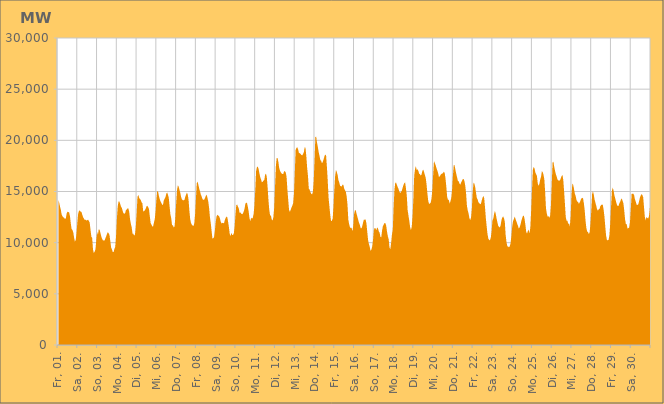
| Category | Series 0 |
|---|---|
|  Fr, 01.  | 14196.781 |
|  Fr, 01.  | 13889.029 |
|  Fr, 01.  | 13515.938 |
|  Fr, 01.  | 13191.746 |
|  Fr, 01.  | 12725.52 |
|  Fr, 01.  | 12569.547 |
|  Fr, 01.  | 12474.975 |
|  Fr, 01.  | 12420.912 |
|  Fr, 01.  | 12313.125 |
|  Fr, 01.  | 12387.478 |
|  Fr, 01.  | 12835.636 |
|  Fr, 01.  | 13022.967 |
|  Fr, 01.  | 12999.57 |
|  Fr, 01.  | 12947.606 |
|  Fr, 01.  | 12610.843 |
|  Fr, 01.  | 11909.457 |
|  Fr, 01.  | 11334.508 |
|  Sa, 02.  | 11243.651 |
|  Sa, 02.  | 11025.805 |
|  Sa, 02.  | 10510.147 |
|  Sa, 02.  | 10113.411 |
|  Sa, 02.  | 10258.602 |
|  Sa, 02.  | 10951.502 |
|  Sa, 02.  | 12000.463 |
|  Sa, 02.  | 12820.62 |
|  Sa, 02.  | 13123.107 |
|  Sa, 02.  | 13139.596 |
|  Sa, 02.  | 13026.616 |
|  Sa, 02.  | 13006.074 |
|  Sa, 02.  | 12724.557 |
|  Sa, 02.  | 12486.146 |
|  Sa, 02.  | 12350.938 |
|  Sa, 02.  | 12218.187 |
|  Sa, 02.  | 12247.661 |
|  Sa, 02.  | 12171.96 |
|  Sa, 02.  | 12195.594 |
|  Sa, 02.  | 12248.212 |
|  Sa, 02.  | 12126.515 |
|  Sa, 02.  | 11941.862 |
|  Sa, 02.  | 11243.829 |
|  Sa, 02.  | 10591.732 |
|  So, 03.  | 10466.988 |
|  So, 03.  | 9327.977 |
|  So, 03.  | 8987.732 |
|  So, 03.  | 9120.806 |
|  So, 03.  | 9350.754 |
|  So, 03.  | 10247.787 |
|  So, 03.  | 11038.326 |
|  So, 03.  | 10764.77 |
|  So, 03.  | 11330.018 |
|  So, 03.  | 11256.473 |
|  So, 03.  | 10960.041 |
|  So, 03.  | 10625.516 |
|  So, 03.  | 10383.805 |
|  So, 03.  | 10238.244 |
|  So, 03.  | 10203.821 |
|  So, 03.  | 10209.658 |
|  So, 03.  | 10414.689 |
|  So, 03.  | 10623.844 |
|  So, 03.  | 10855.771 |
|  So, 03.  | 11031.188 |
|  So, 03.  | 10917.597 |
|  So, 03.  | 10752.594 |
|  So, 03.  | 10164.223 |
|  So, 03.  | 9527.06 |
|  Mo, 04.  | 9345.043 |
|  Mo, 04.  | 9077.423 |
|  Mo, 04.  | 9075.094 |
|  Mo, 04.  | 9407.062 |
|  Mo, 04.  | 9588.436 |
|  Mo, 04.  | 10634.812 |
|  Mo, 04.  | 12308.656 |
|  Mo, 04.  | 13548.577 |
|  Mo, 04.  | 14022.981 |
|  Mo, 04.  | 14019.176 |
|  Mo, 04.  | 13796.53 |
|  Mo, 04.  | 13515.705 |
|  Mo, 04.  | 13399.118 |
|  Mo, 04.  | 13106.473 |
|  Mo, 04.  | 12873.775 |
|  Mo, 04.  | 12814.143 |
|  Mo, 04.  | 12889.657 |
|  Mo, 04.  | 13191.486 |
|  Mo, 04.  | 13247.703 |
|  Mo, 04.  | 13362.139 |
|  Mo, 04.  | 13327.974 |
|  Mo, 04.  | 12992.066 |
|  Mo, 04.  | 12262.674 |
|  Mo, 04.  | 11835.084 |
|  Di, 05.  | 11488.402 |
|  Di, 05.  | 10874.166 |
|  Di, 05.  | 10863.463 |
|  Di, 05.  | 10687.575 |
|  Di, 05.  | 10823.081 |
|  Di, 05.  | 11597.059 |
|  Di, 05.  | 12903.526 |
|  Di, 05.  | 14471.656 |
|  Di, 05.  | 14674.55 |
|  Di, 05.  | 14390.774 |
|  Di, 05.  | 14251.512 |
|  Di, 05.  | 14182.28 |
|  Di, 05.  | 13946.375 |
|  Di, 05.  | 13834.76 |
|  Di, 05.  | 13028.281 |
|  Di, 05.  | 13094.941 |
|  Di, 05.  | 13161.063 |
|  Di, 05.  | 13320.982 |
|  Di, 05.  | 13560.447 |
|  Di, 05.  | 13602.867 |
|  Di, 05.  | 13468.411 |
|  Di, 05.  | 13271.07 |
|  Di, 05.  | 12558.941 |
|  Di, 05.  | 11909.622 |
|  Mi, 06.  | 11769.919 |
|  Mi, 06.  | 11577.832 |
|  Mi, 06.  | 11591.404 |
|  Mi, 06.  | 11959.186 |
|  Mi, 06.  | 12295.539 |
|  Mi, 06.  | 13074.643 |
|  Mi, 06.  | 14230.309 |
|  Mi, 06.  | 15052.93 |
|  Mi, 06.  | 14972.558 |
|  Mi, 06.  | 14584.739 |
|  Mi, 06.  | 14257.847 |
|  Mi, 06.  | 14041.042 |
|  Mi, 06.  | 13872.681 |
|  Mi, 06.  | 13703.724 |
|  Mi, 06.  | 13705.491 |
|  Mi, 06.  | 14146.919 |
|  Mi, 06.  | 14288.768 |
|  Mi, 06.  | 14451.37 |
|  Mi, 06.  | 14784.247 |
|  Mi, 06.  | 14894.961 |
|  Mi, 06.  | 14687.553 |
|  Mi, 06.  | 14373.633 |
|  Mi, 06.  | 13542.987 |
|  Mi, 06.  | 12742.162 |
|  Do, 07.  | 12386.541 |
|  Do, 07.  | 11680.23 |
|  Do, 07.  | 11718.4 |
|  Do, 07.  | 11492.758 |
|  Do, 07.  | 11576.693 |
|  Do, 07.  | 12478.033 |
|  Do, 07.  | 13888.317 |
|  Do, 07.  | 15122.588 |
|  Do, 07.  | 15596.471 |
|  Do, 07.  | 15477.948 |
|  Do, 07.  | 15158.411 |
|  Do, 07.  | 14860.057 |
|  Do, 07.  | 14453.319 |
|  Do, 07.  | 14228.144 |
|  Do, 07.  | 14147.788 |
|  Do, 07.  | 14143.372 |
|  Do, 07.  | 14167.763 |
|  Do, 07.  | 14485.581 |
|  Do, 07.  | 14680.792 |
|  Do, 07.  | 14892.96 |
|  Do, 07.  | 14719.462 |
|  Do, 07.  | 14184.824 |
|  Do, 07.  | 13140.846 |
|  Do, 07.  | 12303.719 |
|  Fr, 08.  | 11917.506 |
|  Fr, 08.  | 11752.211 |
|  Fr, 08.  | 11673.676 |
|  Fr, 08.  | 11632.74 |
|  Fr, 08.  | 11898.082 |
|  Fr, 08.  | 12817.184 |
|  Fr, 08.  | 14331.643 |
|  Fr, 08.  | 15819.918 |
|  Fr, 08.  | 15956.203 |
|  Fr, 08.  | 15628.878 |
|  Fr, 08.  | 15271.224 |
|  Fr, 08.  | 14990.123 |
|  Fr, 08.  | 14683.098 |
|  Fr, 08.  | 14495.453 |
|  Fr, 08.  | 14236.68 |
|  Fr, 08.  | 14188.941 |
|  Fr, 08.  | 14196.219 |
|  Fr, 08.  | 14368.701 |
|  Fr, 08.  | 14579.965 |
|  Fr, 08.  | 14697.263 |
|  Fr, 08.  | 14384.824 |
|  Fr, 08.  | 13999.359 |
|  Fr, 08.  | 13356.142 |
|  Fr, 08.  | 12472.95 |
|  Sa, 09.  | 11893.962 |
|  Sa, 09.  | 11137.84 |
|  Sa, 09.  | 10403.253 |
|  Sa, 09.  | 10428.13 |
|  Sa, 09.  | 10562.002 |
|  Sa, 09.  | 11215.138 |
|  Sa, 09.  | 12019.74 |
|  Sa, 09.  | 12559.553 |
|  Sa, 09.  | 12739.611 |
|  Sa, 09.  | 12648.323 |
|  Sa, 09.  | 12603.098 |
|  Sa, 09.  | 12390.356 |
|  Sa, 09.  | 12069.492 |
|  Sa, 09.  | 11874.267 |
|  Sa, 09.  | 11937.224 |
|  Sa, 09.  | 11916.833 |
|  Sa, 09.  | 11894.661 |
|  Sa, 09.  | 12191.182 |
|  Sa, 09.  | 12405.016 |
|  Sa, 09.  | 12531.218 |
|  Sa, 09.  | 12516.655 |
|  Sa, 09.  | 12045.456 |
|  Sa, 09.  | 11518.654 |
|  Sa, 09.  | 10854.629 |
|  So, 10.  | 10631.512 |
|  So, 10.  | 10957.991 |
|  So, 10.  | 10766.149 |
|  So, 10.  | 10741.158 |
|  So, 10.  | 10904.903 |
|  So, 10.  | 11619.404 |
|  So, 10.  | 12775.6 |
|  So, 10.  | 13668.808 |
|  So, 10.  | 13729.275 |
|  So, 10.  | 13518.232 |
|  So, 10.  | 13348.111 |
|  So, 10.  | 12910.402 |
|  So, 10.  | 12961.622 |
|  So, 10.  | 12842.518 |
|  So, 10.  | 12777.203 |
|  So, 10.  | 12850.701 |
|  So, 10.  | 13039.958 |
|  So, 10.  | 13324.643 |
|  So, 10.  | 13792.683 |
|  So, 10.  | 13911.927 |
|  So, 10.  | 13870.573 |
|  So, 10.  | 13503.201 |
|  So, 10.  | 13054.505 |
|  So, 10.  | 12387.714 |
|  Mo, 11.  | 12101.672 |
|  Mo, 11.  | 12436.196 |
|  Mo, 11.  | 12358.065 |
|  Mo, 11.  | 12425.831 |
|  Mo, 11.  | 12818.782 |
|  Mo, 11.  | 13601.93 |
|  Mo, 11.  | 15121.901 |
|  Mo, 11.  | 16984.08 |
|  Mo, 11.  | 17365.026 |
|  Mo, 11.  | 17444.392 |
|  Mo, 11.  | 17212.537 |
|  Mo, 11.  | 16796.329 |
|  Mo, 11.  | 16413.255 |
|  Mo, 11.  | 16179.383 |
|  Mo, 11.  | 15913.315 |
|  Mo, 11.  | 15953.066 |
|  Mo, 11.  | 16065.04 |
|  Mo, 11.  | 16133.525 |
|  Mo, 11.  | 16637.501 |
|  Mo, 11.  | 16748.798 |
|  Mo, 11.  | 16423.784 |
|  Mo, 11.  | 15419.509 |
|  Mo, 11.  | 14191.516 |
|  Mo, 11.  | 13216.862 |
|  Di, 12.  | 12660.276 |
|  Di, 12.  | 12652.231 |
|  Di, 12.  | 12259.445 |
|  Di, 12.  | 12171.202 |
|  Di, 12.  | 12477.59 |
|  Di, 12.  | 13413.434 |
|  Di, 12.  | 15430.763 |
|  Di, 12.  | 17444.246 |
|  Di, 12.  | 18256.161 |
|  Di, 12.  | 18285.793 |
|  Di, 12.  | 17922.832 |
|  Di, 12.  | 17339.075 |
|  Di, 12.  | 17039.932 |
|  Di, 12.  | 16863.37 |
|  Di, 12.  | 16765.336 |
|  Di, 12.  | 16717.766 |
|  Di, 12.  | 16696.292 |
|  Di, 12.  | 16971.544 |
|  Di, 12.  | 16982.136 |
|  Di, 12.  | 16855.374 |
|  Di, 12.  | 16444.948 |
|  Di, 12.  | 15200.953 |
|  Di, 12.  | 14215.561 |
|  Di, 12.  | 13225.784 |
|  Mi, 13.  | 13001.862 |
|  Mi, 13.  | 13208.451 |
|  Mi, 13.  | 13431.383 |
|  Mi, 13.  | 13617.67 |
|  Mi, 13.  | 13852.125 |
|  Mi, 13.  | 14786.2 |
|  Mi, 13.  | 16779.347 |
|  Mi, 13.  | 19056.015 |
|  Mi, 13.  | 19254.302 |
|  Mi, 13.  | 19330.941 |
|  Mi, 13.  | 19123.434 |
|  Mi, 13.  | 18783.623 |
|  Mi, 13.  | 18743.917 |
|  Mi, 13.  | 18676.128 |
|  Mi, 13.  | 18571.013 |
|  Mi, 13.  | 18524.508 |
|  Mi, 13.  | 18667.186 |
|  Mi, 13.  | 18841.512 |
|  Mi, 13.  | 19325.622 |
|  Mi, 13.  | 19267.449 |
|  Mi, 13.  | 18465.607 |
|  Mi, 13.  | 17330.592 |
|  Mi, 13.  | 16527.411 |
|  Mi, 13.  | 15283.341 |
|  Do, 14.  | 15179.361 |
|  Do, 14.  | 14938.009 |
|  Do, 14.  | 14771.636 |
|  Do, 14.  | 14712.34 |
|  Do, 14.  | 14950.877 |
|  Do, 14.  | 16057.765 |
|  Do, 14.  | 18102.155 |
|  Do, 14.  | 20330.799 |
|  Do, 14.  | 20351.91 |
|  Do, 14.  | 19753.214 |
|  Do, 14.  | 19352.179 |
|  Do, 14.  | 18854.557 |
|  Do, 14.  | 18487.742 |
|  Do, 14.  | 18069.217 |
|  Do, 14.  | 17997.477 |
|  Do, 14.  | 17752.032 |
|  Do, 14.  | 17895.534 |
|  Do, 14.  | 18144.318 |
|  Do, 14.  | 18445.19 |
|  Do, 14.  | 18611.281 |
|  Do, 14.  | 18524.932 |
|  Do, 14.  | 17412.872 |
|  Do, 14.  | 16054.929 |
|  Do, 14.  | 14403.081 |
|  Fr, 15.  | 13575.737 |
|  Fr, 15.  | 12739.455 |
|  Fr, 15.  | 12118.047 |
|  Fr, 15.  | 12141.685 |
|  Fr, 15.  | 12352.223 |
|  Fr, 15.  | 13504.212 |
|  Fr, 15.  | 15185.119 |
|  Fr, 15.  | 16522.789 |
|  Fr, 15.  | 17106.948 |
|  Fr, 15.  | 16915.06 |
|  Fr, 15.  | 16614.457 |
|  Fr, 15.  | 16110.158 |
|  Fr, 15.  | 15883.845 |
|  Fr, 15.  | 15562.124 |
|  Fr, 15.  | 15515.037 |
|  Fr, 15.  | 15490.151 |
|  Fr, 15.  | 15677.381 |
|  Fr, 15.  | 15637.163 |
|  Fr, 15.  | 15284.445 |
|  Fr, 15.  | 15124.788 |
|  Fr, 15.  | 14964.893 |
|  Fr, 15.  | 14509.59 |
|  Fr, 15.  | 13701.58 |
|  Fr, 15.  | 12244.07 |
|  Sa, 16.  | 11814.765 |
|  Sa, 16.  | 11496.851 |
|  Sa, 16.  | 11435.298 |
|  Sa, 16.  | 11450.828 |
|  Sa, 16.  | 11121.19 |
|  Sa, 16.  | 11674.471 |
|  Sa, 16.  | 12781.639 |
|  Sa, 16.  | 13154.793 |
|  Sa, 16.  | 13175.551 |
|  Sa, 16.  | 12824.409 |
|  Sa, 16.  | 12542.872 |
|  Sa, 16.  | 12225.402 |
|  Sa, 16.  | 11940.804 |
|  Sa, 16.  | 11737.504 |
|  Sa, 16.  | 11421.699 |
|  Sa, 16.  | 11395.957 |
|  Sa, 16.  | 11643.402 |
|  Sa, 16.  | 12000.628 |
|  Sa, 16.  | 12269.394 |
|  Sa, 16.  | 12230.542 |
|  Sa, 16.  | 12267.334 |
|  Sa, 16.  | 11876.694 |
|  Sa, 16.  | 11050.507 |
|  Sa, 16.  | 10249.162 |
|  So, 17.  | 9869.58 |
|  So, 17.  | 9602.309 |
|  So, 17.  | 9186.677 |
|  So, 17.  | 9332.015 |
|  So, 17.  | 9617.057 |
|  So, 17.  | 10252.667 |
|  So, 17.  | 11212.45 |
|  So, 17.  | 11451.564 |
|  So, 17.  | 11398.674 |
|  So, 17.  | 11214.457 |
|  So, 17.  | 11491.547 |
|  So, 17.  | 11388.402 |
|  So, 17.  | 11108.809 |
|  So, 17.  | 10971.963 |
|  So, 17.  | 10577.67 |
|  So, 17.  | 10517.826 |
|  So, 17.  | 11186.486 |
|  So, 17.  | 11624.654 |
|  So, 17.  | 11760.538 |
|  So, 17.  | 11926.697 |
|  So, 17.  | 11903.283 |
|  So, 17.  | 11644.35 |
|  So, 17.  | 11068.267 |
|  So, 17.  | 10616.798 |
|  Mo, 18.  | 10341.509 |
|  Mo, 18.  | 9517.055 |
|  Mo, 18.  | 9356.67 |
|  Mo, 18.  | 9994.555 |
|  Mo, 18.  | 10812.18 |
|  Mo, 18.  | 11278.491 |
|  Mo, 18.  | 13410.965 |
|  Mo, 18.  | 15192.284 |
|  Mo, 18.  | 15863.962 |
|  Mo, 18.  | 15856.868 |
|  Mo, 18.  | 15642.133 |
|  Mo, 18.  | 15422.988 |
|  Mo, 18.  | 15252.47 |
|  Mo, 18.  | 14969.384 |
|  Mo, 18.  | 14866.499 |
|  Mo, 18.  | 14952.096 |
|  Mo, 18.  | 15100.813 |
|  Mo, 18.  | 15384.979 |
|  Mo, 18.  | 15643.802 |
|  Mo, 18.  | 15822.718 |
|  Mo, 18.  | 15879.631 |
|  Mo, 18.  | 15293.577 |
|  Mo, 18.  | 14574.801 |
|  Mo, 18.  | 13206.392 |
|  Di, 19.  | 12649.483 |
|  Di, 19.  | 12142.233 |
|  Di, 19.  | 11541.565 |
|  Di, 19.  | 11234.588 |
|  Di, 19.  | 11535.815 |
|  Di, 19.  | 12620.444 |
|  Di, 19.  | 14340.622 |
|  Di, 19.  | 16554.009 |
|  Di, 19.  | 17198.134 |
|  Di, 19.  | 17474.284 |
|  Di, 19.  | 17098.334 |
|  Di, 19.  | 17176.414 |
|  Di, 19.  | 17027.441 |
|  Di, 19.  | 16738.186 |
|  Di, 19.  | 16693.935 |
|  Di, 19.  | 16546.241 |
|  Di, 19.  | 16690.769 |
|  Di, 19.  | 17041.27 |
|  Di, 19.  | 17145.045 |
|  Di, 19.  | 16883.499 |
|  Di, 19.  | 16609.494 |
|  Di, 19.  | 16315.297 |
|  Di, 19.  | 15689.503 |
|  Di, 19.  | 14806.443 |
|  Mi, 20.  | 14090.918 |
|  Mi, 20.  | 13796.793 |
|  Mi, 20.  | 13821.003 |
|  Mi, 20.  | 13919.012 |
|  Mi, 20.  | 14296.491 |
|  Mi, 20.  | 15167.188 |
|  Mi, 20.  | 16632.789 |
|  Mi, 20.  | 17985.234 |
|  Mi, 20.  | 17783.849 |
|  Mi, 20.  | 17579.71 |
|  Mi, 20.  | 17294.15 |
|  Mi, 20.  | 17071.919 |
|  Mi, 20.  | 16804.476 |
|  Mi, 20.  | 16433.156 |
|  Mi, 20.  | 16472.832 |
|  Mi, 20.  | 16622.192 |
|  Mi, 20.  | 16715.035 |
|  Mi, 20.  | 16741.981 |
|  Mi, 20.  | 16816.059 |
|  Mi, 20.  | 16926.027 |
|  Mi, 20.  | 16816.78 |
|  Mi, 20.  | 16273.933 |
|  Mi, 20.  | 15451.146 |
|  Mi, 20.  | 14473.842 |
|  Do, 21.  | 14193.364 |
|  Do, 21.  | 14181.026 |
|  Do, 21.  | 13835.829 |
|  Do, 21.  | 14033.507 |
|  Do, 21.  | 14390.707 |
|  Do, 21.  | 15184.296 |
|  Do, 21.  | 16540.941 |
|  Do, 21.  | 17599.35 |
|  Do, 21.  | 17564.729 |
|  Do, 21.  | 17131.028 |
|  Do, 21.  | 16743.593 |
|  Do, 21.  | 16404.915 |
|  Do, 21.  | 16054.544 |
|  Do, 21.  | 15990.206 |
|  Do, 21.  | 15771.01 |
|  Do, 21.  | 15665.438 |
|  Do, 21.  | 15890.924 |
|  Do, 21.  | 16041.411 |
|  Do, 21.  | 16220.954 |
|  Do, 21.  | 16220.918 |
|  Do, 21.  | 16010.897 |
|  Do, 21.  | 15564.99 |
|  Do, 21.  | 14794.138 |
|  Do, 21.  | 13603.932 |
|  Fr, 22.  | 13144.289 |
|  Fr, 22.  | 12859.191 |
|  Fr, 22.  | 12399.109 |
|  Fr, 22.  | 12205.471 |
|  Fr, 22.  | 12468.22 |
|  Fr, 22.  | 13347.959 |
|  Fr, 22.  | 14892.235 |
|  Fr, 22.  | 15872.905 |
|  Fr, 22.  | 15776.642 |
|  Fr, 22.  | 15457.914 |
|  Fr, 22.  | 14890 |
|  Fr, 22.  | 14381.077 |
|  Fr, 22.  | 14214.072 |
|  Fr, 22.  | 13945.294 |
|  Fr, 22.  | 13875.813 |
|  Fr, 22.  | 13750.808 |
|  Fr, 22.  | 13801.49 |
|  Fr, 22.  | 14134.401 |
|  Fr, 22.  | 14390.522 |
|  Fr, 22.  | 14573.535 |
|  Fr, 22.  | 14343.864 |
|  Fr, 22.  | 13418.777 |
|  Fr, 22.  | 12367.263 |
|  Fr, 22.  | 11566.501 |
|  Sa, 23.  | 10836.269 |
|  Sa, 23.  | 10397.321 |
|  Sa, 23.  | 10269.965 |
|  Sa, 23.  | 10230.215 |
|  Sa, 23.  | 10505.72 |
|  Sa, 23.  | 11149.539 |
|  Sa, 23.  | 12178.607 |
|  Sa, 23.  | 12348.671 |
|  Sa, 23.  | 12808.291 |
|  Sa, 23.  | 13110.561 |
|  Sa, 23.  | 12796.371 |
|  Sa, 23.  | 12368.357 |
|  Sa, 23.  | 11994.231 |
|  Sa, 23.  | 11643.946 |
|  Sa, 23.  | 11543.225 |
|  Sa, 23.  | 11486.517 |
|  Sa, 23.  | 11731.484 |
|  Sa, 23.  | 12219.641 |
|  Sa, 23.  | 12463.257 |
|  Sa, 23.  | 12564.7 |
|  Sa, 23.  | 12397.292 |
|  Sa, 23.  | 12047.777 |
|  Sa, 23.  | 10782.757 |
|  Sa, 23.  | 10082.436 |
|  So, 24.  | 9662.915 |
|  So, 24.  | 9621.322 |
|  So, 24.  | 9559.154 |
|  So, 24.  | 9648.089 |
|  So, 24.  | 9942.893 |
|  So, 24.  | 10652.755 |
|  So, 24.  | 11579.443 |
|  So, 24.  | 12106.403 |
|  So, 24.  | 12308.558 |
|  So, 24.  | 12545.25 |
|  So, 24.  | 12325.932 |
|  So, 24.  | 12092.588 |
|  So, 24.  | 11864.9 |
|  So, 24.  | 11641.948 |
|  So, 24.  | 11383.815 |
|  So, 24.  | 11507.578 |
|  So, 24.  | 11744.352 |
|  So, 24.  | 12105.721 |
|  So, 24.  | 12390.515 |
|  So, 24.  | 12598.194 |
|  So, 24.  | 12655.219 |
|  So, 24.  | 12312.621 |
|  So, 24.  | 11743.375 |
|  So, 24.  | 11033.871 |
|  Mo, 25.  | 10901.881 |
|  Mo, 25.  | 11135.111 |
|  Mo, 25.  | 11277.785 |
|  Mo, 25.  | 10898.146 |
|  Mo, 25.  | 11498.579 |
|  Mo, 25.  | 13140.766 |
|  Mo, 25.  | 15137.51 |
|  Mo, 25.  | 17105.65 |
|  Mo, 25.  | 17398.049 |
|  Mo, 25.  | 17286.85 |
|  Mo, 25.  | 16886.025 |
|  Mo, 25.  | 16692.233 |
|  Mo, 25.  | 16523.649 |
|  Mo, 25.  | 15804.424 |
|  Mo, 25.  | 15548.487 |
|  Mo, 25.  | 15752.638 |
|  Mo, 25.  | 16178.619 |
|  Mo, 25.  | 16446.135 |
|  Mo, 25.  | 16989.119 |
|  Mo, 25.  | 16895.645 |
|  Mo, 25.  | 16631.103 |
|  Mo, 25.  | 16181.979 |
|  Mo, 25.  | 14934.839 |
|  Mo, 25.  | 13342.888 |
|  Di, 26.  | 12845.457 |
|  Di, 26.  | 12548.601 |
|  Di, 26.  | 12600.633 |
|  Di, 26.  | 12434.472 |
|  Di, 26.  | 12620.694 |
|  Di, 26.  | 13638.269 |
|  Di, 26.  | 15693.495 |
|  Di, 26.  | 17823.941 |
|  Di, 26.  | 17912.49 |
|  Di, 26.  | 17411.838 |
|  Di, 26.  | 17021.616 |
|  Di, 26.  | 16685.449 |
|  Di, 26.  | 16452.362 |
|  Di, 26.  | 16165.599 |
|  Di, 26.  | 16084.365 |
|  Di, 26.  | 16073.237 |
|  Di, 26.  | 16084.496 |
|  Di, 26.  | 16304.114 |
|  Di, 26.  | 16515.967 |
|  Di, 26.  | 16622.575 |
|  Di, 26.  | 16113.833 |
|  Di, 26.  | 15004.455 |
|  Di, 26.  | 13796.568 |
|  Di, 26.  | 12503.853 |
|  Mi, 27.  | 12138.185 |
|  Mi, 27.  | 12145.852 |
|  Mi, 27.  | 11830.194 |
|  Mi, 27.  | 11880.772 |
|  Mi, 27.  | 11588.664 |
|  Mi, 27.  | 12632.474 |
|  Mi, 27.  | 14720.992 |
|  Mi, 27.  | 15764.807 |
|  Mi, 27.  | 15657.926 |
|  Mi, 27.  | 15248.068 |
|  Mi, 27.  | 14801.098 |
|  Mi, 27.  | 14573.055 |
|  Mi, 27.  | 14185.956 |
|  Mi, 27.  | 14027.022 |
|  Mi, 27.  | 13965.777 |
|  Mi, 27.  | 13799.603 |
|  Mi, 27.  | 13935.723 |
|  Mi, 27.  | 14140.493 |
|  Mi, 27.  | 14322.99 |
|  Mi, 27.  | 14386.656 |
|  Mi, 27.  | 14326.352 |
|  Mi, 27.  | 13840.238 |
|  Mi, 27.  | 13159.438 |
|  Mi, 27.  | 12156.209 |
|  Do, 28.  | 11441.067 |
|  Do, 28.  | 11076.3 |
|  Do, 28.  | 11066.689 |
|  Do, 28.  | 10831.313 |
|  Do, 28.  | 11022.601 |
|  Do, 28.  | 11853.369 |
|  Do, 28.  | 13148.854 |
|  Do, 28.  | 14753.034 |
|  Do, 28.  | 15021.146 |
|  Do, 28.  | 14706.414 |
|  Do, 28.  | 14221.873 |
|  Do, 28.  | 13908.006 |
|  Do, 28.  | 13613.863 |
|  Do, 28.  | 13271.226 |
|  Do, 28.  | 13137.314 |
|  Do, 28.  | 13253.394 |
|  Do, 28.  | 13308.214 |
|  Do, 28.  | 13577.235 |
|  Do, 28.  | 13677.885 |
|  Do, 28.  | 13733.56 |
|  Do, 28.  | 13690.279 |
|  Do, 28.  | 13205.603 |
|  Do, 28.  | 12530.373 |
|  Do, 28.  | 11548.053 |
|  Fr, 29.  | 10682.056 |
|  Fr, 29.  | 10254.141 |
|  Fr, 29.  | 10238.874 |
|  Fr, 29.  | 10275.698 |
|  Fr, 29.  | 10745.193 |
|  Fr, 29.  | 11881.249 |
|  Fr, 29.  | 13511.886 |
|  Fr, 29.  | 15030.954 |
|  Fr, 29.  | 15388.641 |
|  Fr, 29.  | 15112.545 |
|  Fr, 29.  | 14654.223 |
|  Fr, 29.  | 14337.913 |
|  Fr, 29.  | 14019.155 |
|  Fr, 29.  | 13732.497 |
|  Fr, 29.  | 13582.286 |
|  Fr, 29.  | 13587.113 |
|  Fr, 29.  | 13839.265 |
|  Fr, 29.  | 13987.88 |
|  Fr, 29.  | 14208.684 |
|  Fr, 29.  | 14329.966 |
|  Fr, 29.  | 14091.196 |
|  Fr, 29.  | 13854.083 |
|  Fr, 29.  | 13152.831 |
|  Fr, 29.  | 12285.905 |
|  Sa, 30.  | 11834.046 |
|  Sa, 30.  | 11805.156 |
|  Sa, 30.  | 11372.291 |
|  Sa, 30.  | 11422.729 |
|  Sa, 30.  | 11479.714 |
|  Sa, 30.  | 11999.62 |
|  Sa, 30.  | 13319.487 |
|  Sa, 30.  | 14798.901 |
|  Sa, 30.  | 14766.652 |
|  Sa, 30.  | 14785.328 |
|  Sa, 30.  | 14650.896 |
|  Sa, 30.  | 14245.776 |
|  Sa, 30.  | 14012.545 |
|  Sa, 30.  | 13715.956 |
|  Sa, 30.  | 13689.118 |
|  Sa, 30.  | 13727.904 |
|  Sa, 30.  | 14035.322 |
|  Sa, 30.  | 14392.981 |
|  Sa, 30.  | 14609.741 |
|  Sa, 30.  | 14751.612 |
|  Sa, 30.  | 14658.528 |
|  Sa, 30.  | 14439.183 |
|  Sa, 30.  | 13505.446 |
|  Sa, 30.  | 12525.828 |
|  So, 01.  | 12185.8 |
|  So, 01.  | 12511.242 |
|  So, 01.  | 12410.025 |
|  So, 01.  | 12370.2 |
|  So, 01.  | 12565.257 |
|  So, 01.  | 13202.778 |
|    | 14555.239 |